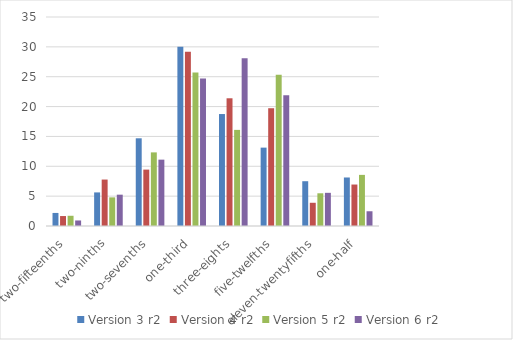
| Category | Version 3 r2 | Version 4 r2 | Version 5 r2 | Version 6 r2 |
|---|---|---|---|---|
| two-fifteenths | 2.188 | 1.667 | 1.712 | 0.926 |
| two-ninths | 5.625 | 7.778 | 4.795 | 5.247 |
| two-sevenths | 14.688 | 9.444 | 12.329 | 11.111 |
| one-third | 30 | 29.167 | 25.685 | 24.691 |
| three-eights | 18.75 | 21.389 | 16.096 | 28.086 |
| five-twelfths | 13.125 | 19.722 | 25.342 | 21.914 |
| eleven-twentyfifths | 7.5 | 3.889 | 5.479 | 5.556 |
| one-half | 8.125 | 6.944 | 8.562 | 2.469 |